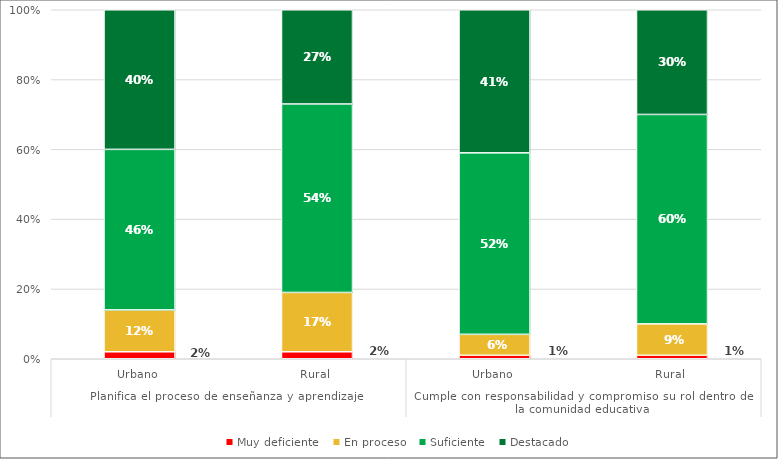
| Category | Muy deficiente | En proceso | Suficiente | Destacado |
|---|---|---|---|---|
| 0 | 0.02 | 0.12 | 0.46 | 0.4 |
| 1 | 0.02 | 0.17 | 0.54 | 0.27 |
| 2 | 0.01 | 0.06 | 0.52 | 0.41 |
| 3 | 0.01 | 0.09 | 0.6 | 0.3 |